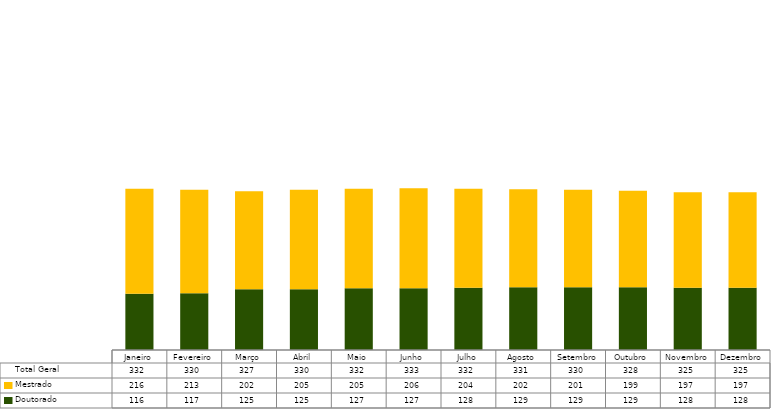
| Category | Doutorado                      | Mestrado                       | Total Geral |
|---|---|---|---|
| Janeiro | 116 | 216 | 332 |
| Fevereiro | 117 | 213 | 330 |
| Março | 125 | 202 | 327 |
| Abril | 125 | 205 | 330 |
| Maio | 127 | 205 | 332 |
| Junho | 127 | 206 | 333 |
| Julho | 128 | 204 | 332 |
| Agosto | 129 | 202 | 331 |
| Setembro | 129 | 201 | 330 |
| Outubro | 129 | 199 | 328 |
| Novembro | 128 | 197 | 325 |
| Dezembro | 128 | 197 | 325 |